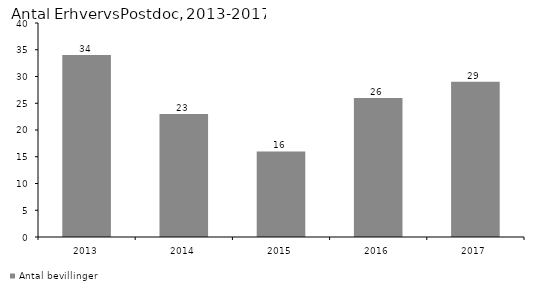
| Category | Antal bevillinger |
|---|---|
| 2013.0 | 34 |
| 2014.0 | 23 |
| 2015.0 | 16 |
| 2016.0 | 26 |
| 2017.0 | 29 |